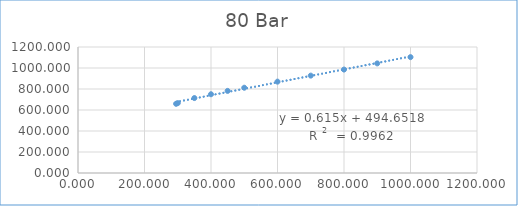
| Category | Series 0 |
|---|---|
| 295.0 | 659.03 |
| 300.0 | 665.671 |
| 350.0 | 713.832 |
| 400.0 | 749.976 |
| 450.0 | 781.964 |
| 500.0 | 812.112 |
| 600.0 | 870.139 |
| 700.0 | 927.425 |
| 800.0 | 985.141 |
| 900.0 | 1043.789 |
| 1000.0 | 1103.583 |